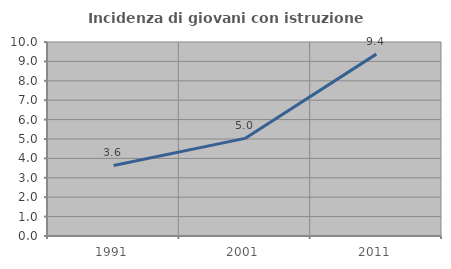
| Category | Incidenza di giovani con istruzione universitaria |
|---|---|
| 1991.0 | 3.636 |
| 2001.0 | 5.031 |
| 2011.0 | 9.375 |